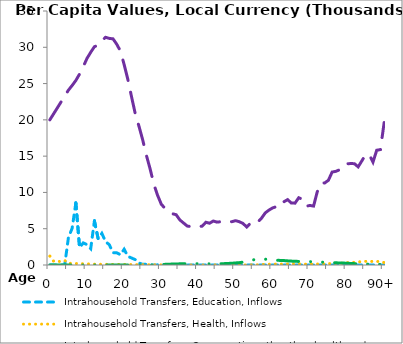
| Category | Intrahousehold Transfers, Education, Inflows | Intrahousehold Transfers, Health, Inflows | Intrahousehold Transfers, Consumption other than health and education, Inflows | Intrahousehold Transfers, Saving, Inflows |
|---|---|---|---|---|
| 0 | 0 | 1221.938 | 20003.433 | 0 |
|  | 0 | 530.544 | 20821.025 | 0 |
| 2 | 0 | 478.077 | 21638.616 | 0 |
| 3 | 0 | 500.698 | 22456.208 | 0 |
| 4 | 0 | 624.114 | 23273.8 | 0 |
| 5 | 3789.32 | 241.627 | 24091.391 | 0 |
| 6 | 5055.68 | 222.503 | 24735.802 | 0 |
| 7 | 8565.355 | 203.379 | 25432.58 | 0 |
| 8 | 2399.402 | 184.256 | 26311.428 | 0 |
| 9 | 3045.895 | 165.132 | 27337.867 | 0 |
| 10 | 2813.379 | 146.008 | 28469.807 | 0 |
| 11 | 2253.801 | 130.514 | 29311.523 | 0 |
| 12 | 6087.626 | 119.737 | 30080.876 | 0 |
| 13 | 3627.094 | 104.942 | 30283.418 | 0 |
| 14 | 4354.842 | 96.753 | 30872.732 | 0 |
| 15 | 3224.885 | 87.996 | 31375.618 | 0 |
| 16 | 2798.819 | 85.702 | 31224.029 | 0 |
| 17 | 1688.605 | 84.16 | 31165.983 | 0 |
| 18 | 1690.471 | 81.251 | 30428.614 | 0 |
| 19 | 1411.28 | 79.011 | 29474.52 | 0 |
| 20 | 2169.739 | 73.462 | 27617.263 | 0 |
| 21 | 1192.979 | 69.546 | 25568.401 | 0 |
| 22 | 964.089 | 62.859 | 23161.503 | 0 |
| 23 | 739.324 | 55.415 | 20830.702 | 0 |
| 24 | 276.217 | 50.111 | 19107.424 | 0 |
| 25 | 85.726 | 50.416 | 17230.686 | 0 |
| 26 | 103.706 | 46.115 | 15093.407 | 0 |
| 27 | 6.299 | 38.125 | 13224.991 | 0 |
| 28 | 0 | 30.601 | 11132.648 | 20.315 |
| 29 | 20.542 | 25.937 | 9610.025 | 42.878 |
| 30 | 21.012 | 20.693 | 8376.432 | 65.394 |
| 31 | 8.724 | 18.414 | 7801.577 | 87.909 |
| 32 | 0 | 15.058 | 7275.588 | 110.328 |
| 33 | 0 | 14.226 | 7067.81 | 129.073 |
| 34 | 0 | 14.103 | 6928.445 | 144.904 |
| 35 | 0 | 10.569 | 6208.156 | 158.365 |
| 36 | 0 | 3.126 | 5782.02 | 168.606 |
| 37 | 0 | 0 | 5365.09 | 178.935 |
| 38 | 0 | 2.954 | 5290.861 | 182.649 |
| 39 | 0 | 2.987 | 5275.052 | 182.582 |
| 40 | 0 | 3.016 | 5277.765 | 178.303 |
| 41 | 0 | 3.041 | 5349.308 | 171.326 |
| 42 | 0 | 11.648 | 5890.851 | 162.919 |
| 43 | 0 | 11.786 | 5756.196 | 158.84 |
| 44 | 0 | 15.943 | 6059.823 | 160.216 |
| 45 | 0 | 16.082 | 5909.52 | 162.334 |
| 46 | 0 | 16.166 | 5967.84 | 176.679 |
| 47 | 0 | 18.231 | 6037.75 | 189.609 |
| 48 | 0 | 18.207 | 6015.786 | 215.182 |
| 49 | 0 | 15.269 | 5967.39 | 243.177 |
| 50 | 0 | 15.202 | 6108.868 | 284.706 |
| 51 | 0 | 15.102 | 5968.768 | 321.215 |
| 52 | 0 | 14.974 | 5723.904 | 396.117 |
| 53 | 0 | 6.269 | 5239.465 | 497.31 |
| 54 | 0 | 18.467 | 5755.756 | 633 |
| 55 | 0 | 24.222 | 5596.442 | 737.42 |
| 56 | 0 | 30.373 | 5921.563 | 819.114 |
| 57 | 0 | 43.976 | 6464.47 | 830.744 |
| 58 | 0 | 98.767 | 7181.325 | 799.432 |
| 59 | 0 | 113.985 | 7570.179 | 737.243 |
| 60 | 0 | 118.229 | 7872.596 | 689.244 |
| 61 | 0 | 123.453 | 8046.34 | 651.101 |
| 62 | 0 | 123.968 | 7998.591 | 633.229 |
| 63 | 0 | 132.673 | 8709.579 | 610.592 |
| 64 | 0 | 136.239 | 9008.342 | 569.407 |
| 65 | 0 | 131.366 | 8549.072 | 537.322 |
| 66 | 0 | 131.194 | 8522.757 | 511.21 |
| 67 | 0 | 149.333 | 9263.33 | 493.93 |
| 68 | 0 | 160.212 | 9058.948 | 482.759 |
| 69 | 0 | 109.686 | 8093.466 | 478.033 |
| 70 | 0 | 116.378 | 8203.939 | 465.821 |
| 71 | 0 | 125.341 | 8120.179 | 451.014 |
| 72 | 0 | 133.086 | 10105.174 | 431.288 |
| 73 | 0 | 144.702 | 11288.658 | 407.185 |
| 74 | 0 | 159.739 | 11303.353 | 376.883 |
| 75 | 0 | 184.219 | 11679.077 | 351.464 |
| 76 | 0 | 212.886 | 12807.61 | 326.694 |
| 77 | 0 | 214.221 | 12906.169 | 300.633 |
| 78 | 0 | 243.902 | 13123.907 | 282.021 |
| 79 | 0 | 265.956 | 13319.185 | 268.42 |
| 80 | 0 | 327.602 | 13948.067 | 241.865 |
| 81 | 0 | 350.839 | 13978.449 | 213.076 |
| 82 | 0 | 367.343 | 13963.648 | 186.973 |
| 83 | 0 | 424.667 | 13521.546 | 162.815 |
| 84 | 0 | 469.742 | 14352.962 | 143.629 |
| 85 | 0 | 502.127 | 15196.649 | 132.046 |
| 86 | 0 | 500.018 | 15218.529 | 123.109 |
| 87 | 0 | 490.11 | 14180.273 | 116.553 |
| 88 | 0 | 495.721 | 15813.335 | 101.553 |
| 89 | 0 | 462.988 | 15904.214 | 82.253 |
| 90+ | 0 | 335.72 | 19625.805 | 36.615 |